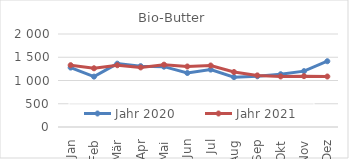
| Category | Jahr 2020 | Jahr 2021 |
|---|---|---|
| Jan | 1277.91 | 1329.436 |
| Feb | 1083.661 | 1263.092 |
| Mär | 1362.046 | 1328.295 |
| Apr | 1308.886 | 1281.103 |
| Mai | 1297.324 | 1340.521 |
| Jun | 1161.058 | 1301.196 |
| Jul | 1234.348 | 1322.453 |
| Aug | 1072.282 | 1181.803 |
| Sep | 1090.855 | 1109.812 |
| Okt | 1135.049 | 1086.763 |
| Nov | 1200.804 | 1093.476 |
| Dez | 1414.489 | 1085.695 |